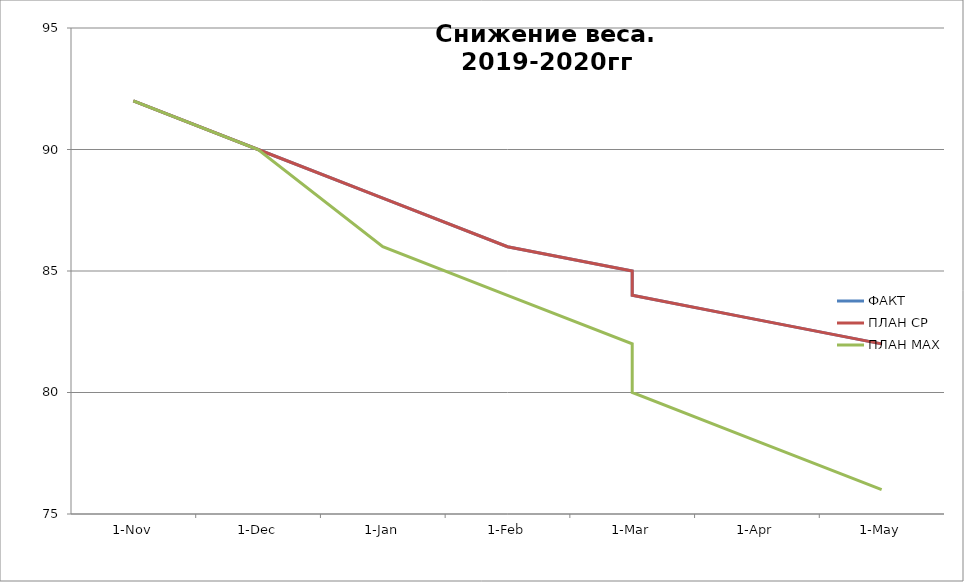
| Category | ФАКТ | ПЛАН СР | ПЛАН МАХ |
|---|---|---|---|
| 2019-11-01 | 92 | 92 | 92 |
| 2019-12-01 | 90 | 90 | 90 |
| 2020-01-01 | 88 | 88 | 86 |
| 2020-02-01 | 86 | 86 | 84 |
| 2020-03-01 | 85 | 85 | 82 |
| 2020-03-15 | 84 | 84 | 80 |
| 2020-04-01 | 83 | 83 | 78 |
| 2020-05-01 | 82 | 82 | 76 |